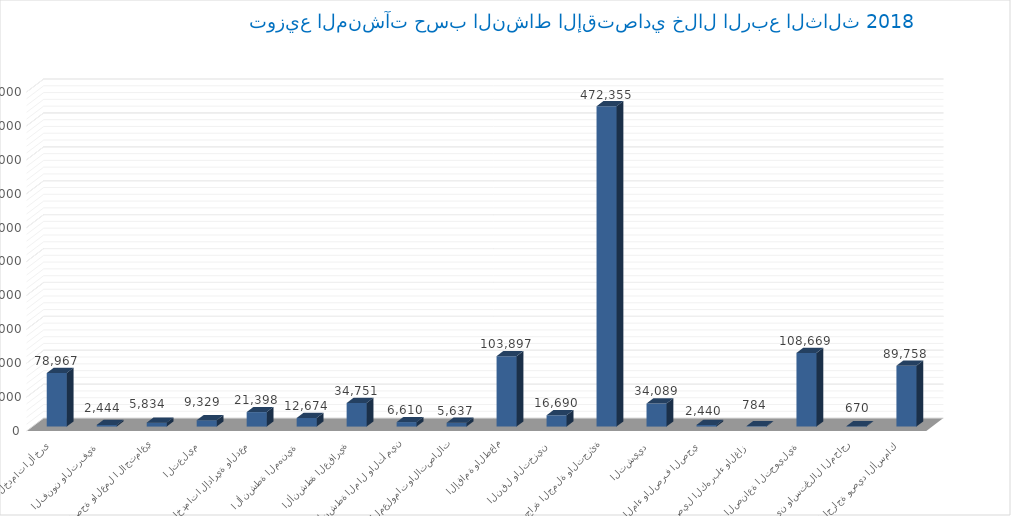
| Category | عدد المنشآت |
|---|---|
| الزراعة والحراجة وصيد الأسماك | 89758 |
| التعدين واستغلال المحاجر | 670 |
| الصناعة التحويلية | 108669 |
| توصيل الكهرباء والغاز  | 784 |
| امدادات الماء والصرف الصحي | 2440 |
| التشييد | 34089 |
| تجارة الجملة والتجزئة | 472355 |
| النقل والتخزين | 16690 |
| الإقامة والطعام | 103897 |
| المعلومات والاتصالات | 5637 |
| أنشطة المال والتأمين | 6610 |
| الأنشطة العقارية | 34751 |
| الأنشطة المهنية  | 12674 |
| الخدمات الإدارية والدعم | 21398 |
| التعليم | 9329 |
| الصحة والعمل الاجتماعي | 5834 |
| الفنون والترفية | 2444 |
| الخدمات الأخرى | 78967 |